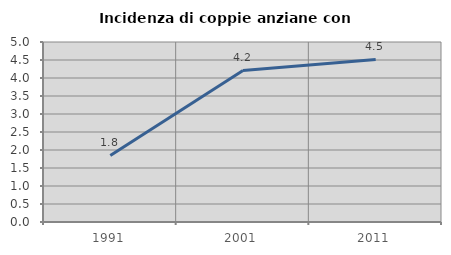
| Category | Incidenza di coppie anziane con figli |
|---|---|
| 1991.0 | 1.849 |
| 2001.0 | 4.209 |
| 2011.0 | 4.515 |